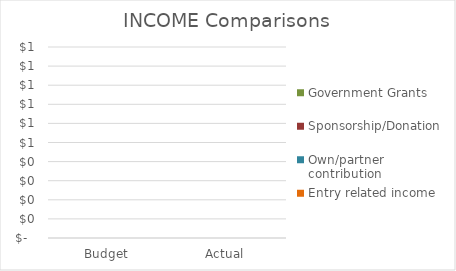
| Category | Entry related income | Own/partner contribution | Sponsorship/Donation | Government Grants |
|---|---|---|---|---|
| Budget | 0 | 0 | 0 | 0 |
| Actual | 0 | 0 | 0 | 0 |